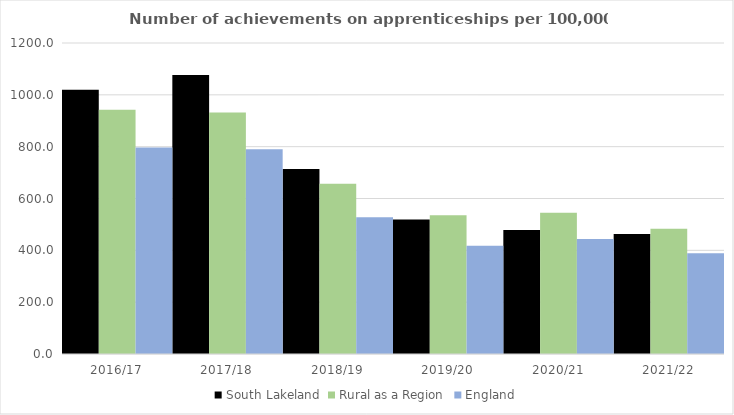
| Category | South Lakeland | Rural as a Region | England |
|---|---|---|---|
| 2016/17 | 1020 | 942.594 | 797 |
| 2017/18 | 1077 | 931.709 | 790 |
| 2018/19 | 714 | 656.44 | 528 |
| 2019/20 | 519 | 535.552 | 418 |
| 2020/21 | 478 | 545.333 | 444 |
| 2021/22 | 463 | 482.936 | 389 |